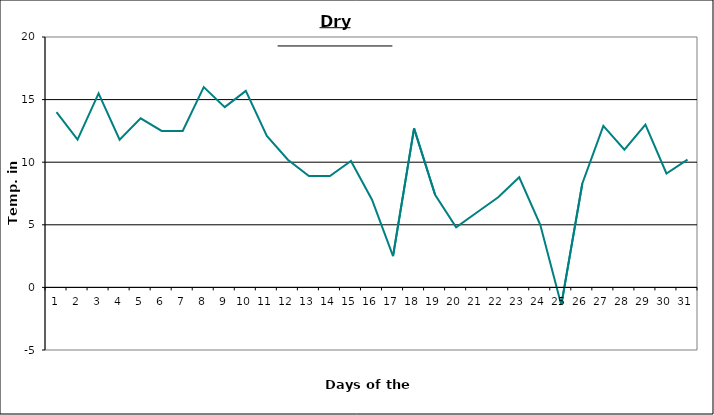
| Category | Series 0 |
|---|---|
| 0 | 14 |
| 1 | 11.8 |
| 2 | 15.5 |
| 3 | 11.8 |
| 4 | 13.5 |
| 5 | 12.5 |
| 6 | 12.5 |
| 7 | 16 |
| 8 | 14.4 |
| 9 | 15.7 |
| 10 | 12.1 |
| 11 | 10.2 |
| 12 | 8.9 |
| 13 | 8.9 |
| 14 | 10.1 |
| 15 | 7 |
| 16 | 2.5 |
| 17 | 12.7 |
| 18 | 7.4 |
| 19 | 4.8 |
| 20 | 6 |
| 21 | 7.2 |
| 22 | 8.8 |
| 23 | 5 |
| 24 | -1.4 |
| 25 | 8.3 |
| 26 | 12.9 |
| 27 | 11 |
| 28 | 13 |
| 29 | 9.1 |
| 30 | 10.2 |